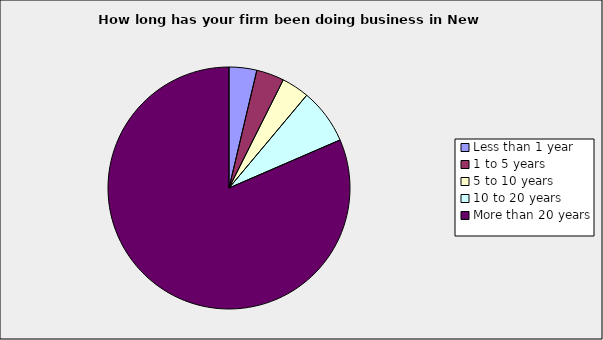
| Category | Series 0 |
|---|---|
| Less than 1 year | 0.037 |
| 1 to 5 years | 0.037 |
| 5 to 10 years | 0.037 |
| 10 to 20 years | 0.074 |
| More than 20 years | 0.815 |